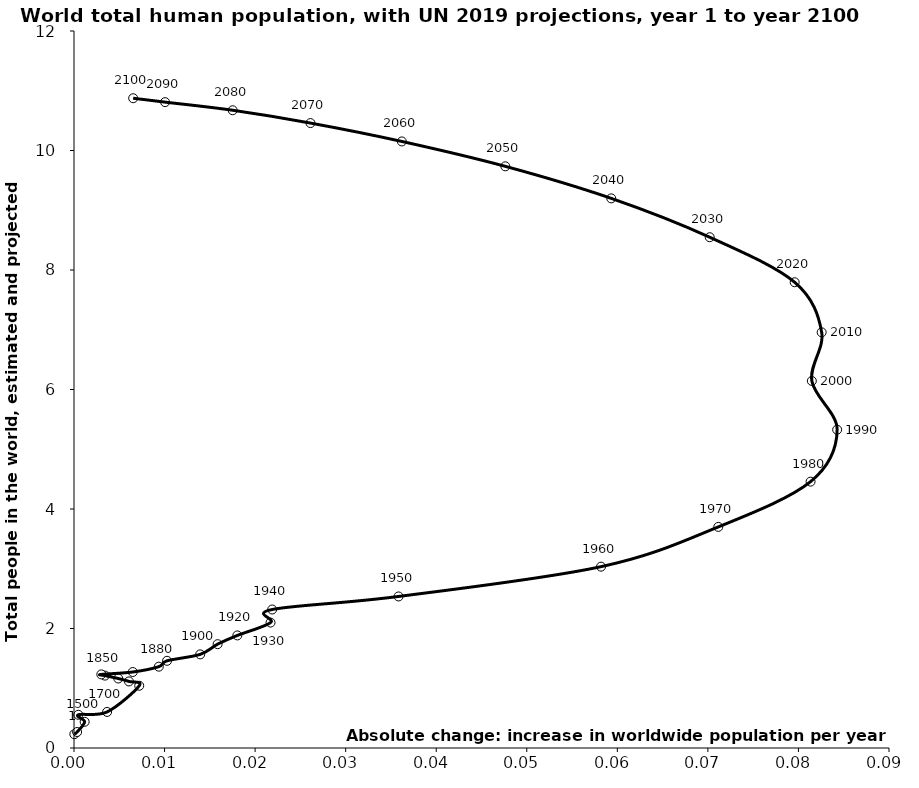
| Category | Series 0 |
|---|---|
| 3.6753000000000005e-05 | 0.231 |
| 0.00034170999999999995 | 0.268 |
| 0.0011772 | 0.438 |
| 0.00047341999999999995 | 0.556 |
| 0.003652866666666666 | 0.603 |
| 0.007202922348725549 | 1.042 |
| 0.006066851472580759 | 1.114 |
| 0.004885489039188495 | 1.163 |
| 0.0034150005009054964 | 1.212 |
| 0.003017099786448729 | 1.231 |
| 0.006489837157338985 | 1.272 |
| 0.009368038995913453 | 1.361 |
| 0.010276072585718443 | 1.459 |
| 0.013933965678965122 | 1.567 |
| 0.015861353266234546 | 1.738 |
| 0.01803809098330276 | 1.884 |
| 0.021703395935288017 | 2.099 |
| 0.02188571179181864 | 2.318 |
| 0.03584327648193382 | 2.536 |
| 0.05820029484999993 | 3.035 |
| 0.07115268829999996 | 3.7 |
| 0.08133970075000019 | 4.458 |
| 0.08427451544999993 | 5.327 |
| 0.08147962710000023 | 6.143 |
| 0.08256524579999991 | 6.957 |
| 0.07958318984999972 | 7.795 |
| 0.0702024250500001 | 8.548 |
| 0.05932732949999986 | 9.199 |
| 0.047630076050000004 | 9.735 |
| 0.03620592584999995 | 10.151 |
| 0.026113535649999874 | 10.459 |
| 0.01752116475000003 | 10.674 |
| 0.010059142200000171 | 10.81 |
| 0.00653265160000025 | 10.875 |